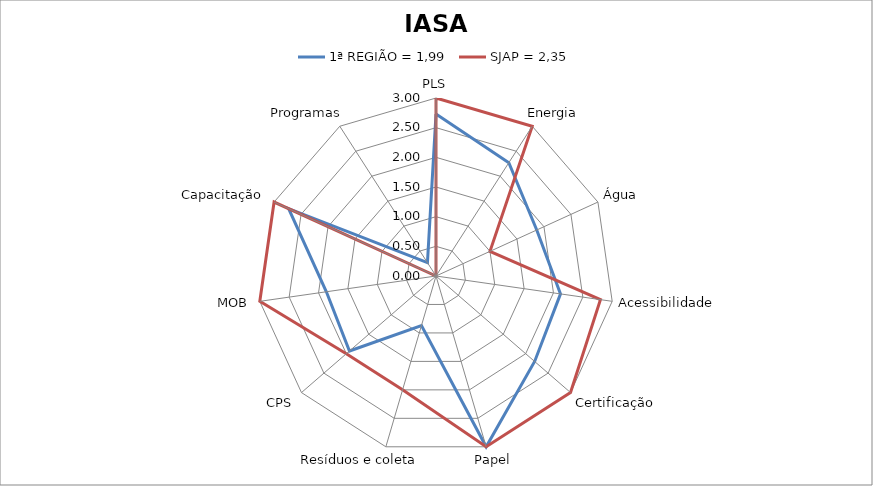
| Category | 1ª REGIÃO = 1,99 | SJAP = 2,35 |
|---|---|---|
| PLS | 2.73 | 3 |
| Energia | 2.27 | 3 |
| Água | 1.867 | 1 |
| Acessibilidade | 2.12 | 2.8 |
| Certificação | 2.2 | 3 |
| Papel | 3 | 3 |
| Resíduos e coleta | 0.87 | 2 |
| CPS | 1.93 | 2 |
| MOB | 1.867 | 3 |
| Capacitação | 2.73 | 3 |
| Programas | 0.267 | 0 |